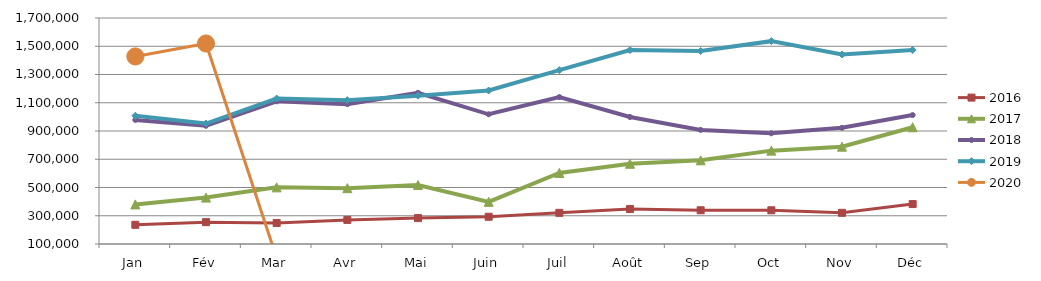
| Category | 2015 | 2016 | 2017 | 2018 | 2019 | 2020 |
|---|---|---|---|---|---|---|
| Jan |  | 235903.093 | 380222.25 | 978468.279 | 1007982.373 | 1427566.131 |
| Fév |  | 254650.591 | 428502.997 | 937137.209 | 952616.766 | 1519499.131 |
| Mar |  | 248425.98 | 500955.694 | 1110199.711 | 1129815.679 | 0 |
| Avr |  | 270687.752 | 495255.535 | 1090229.308 | 1118398.221 | 0 |
| Mai |  | 283507.34 | 517298.538 | 1170512.154 | 1150217.455 | 0 |
| Juin |  | 292820.053 | 398427.247 | 1018295.812 | 1186623.687 | 0 |
| Juil |  | 320615.91 | 603419.402 | 1140133.118 | 1330812.699 | 0 |
| Août |  | 348014.816 | 667973.667 | 999343.146 | 1473280.035 | 0 |
| Sep |  | 338807.949 | 692403.495 | 907808.882 | 1466448.158 | 0 |
| Oct |  | 338820.212 | 760969.174 | 883825.979 | 1536100.268 | 0 |
| Nov |  | 320858.147 | 789037.665 | 922678.039 | 1441770.199 | 0 |
| Déc |  | 382727.181 | 926372.399 | 1012620.724 | 1473565.92 | 0 |